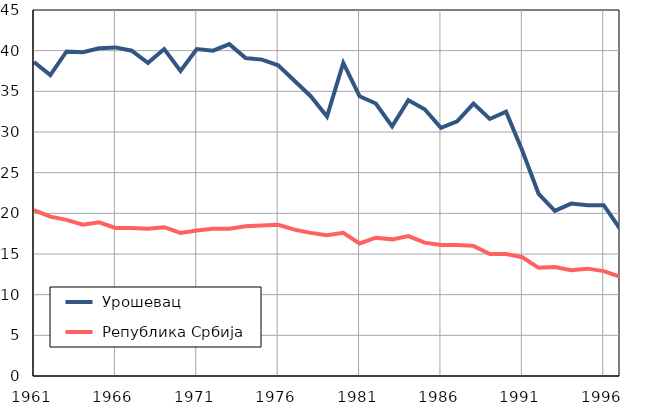
| Category |  Урошевац |  Република Србија |
|---|---|---|
| 1961.0 | 38.6 | 20.4 |
| 1962.0 | 37 | 19.6 |
| 1963.0 | 39.9 | 19.2 |
| 1964.0 | 39.8 | 18.6 |
| 1965.0 | 40.3 | 18.9 |
| 1966.0 | 40.4 | 18.2 |
| 1967.0 | 40 | 18.2 |
| 1968.0 | 38.5 | 18.1 |
| 1969.0 | 40.2 | 18.3 |
| 1970.0 | 37.5 | 17.6 |
| 1971.0 | 40.2 | 17.9 |
| 1972.0 | 40 | 18.1 |
| 1973.0 | 40.8 | 18.1 |
| 1974.0 | 39.1 | 18.4 |
| 1975.0 | 38.9 | 18.5 |
| 1976.0 | 38.2 | 18.6 |
| 1977.0 | 36.3 | 18 |
| 1978.0 | 34.4 | 17.6 |
| 1979.0 | 31.9 | 17.3 |
| 1980.0 | 38.5 | 17.6 |
| 1981.0 | 34.4 | 16.3 |
| 1982.0 | 33.5 | 17 |
| 1983.0 | 30.7 | 16.8 |
| 1984.0 | 33.9 | 17.2 |
| 1985.0 | 32.8 | 16.4 |
| 1986.0 | 30.5 | 16.1 |
| 1987.0 | 31.3 | 16.1 |
| 1988.0 | 33.5 | 16 |
| 1989.0 | 31.6 | 15 |
| 1990.0 | 32.5 | 15 |
| 1991.0 | 27.7 | 14.6 |
| 1992.0 | 22.4 | 13.3 |
| 1993.0 | 20.3 | 13.4 |
| 1994.0 | 21.2 | 13 |
| 1995.0 | 21 | 13.2 |
| 1996.0 | 21 | 12.9 |
| 1997.0 | 18.1 | 12.2 |